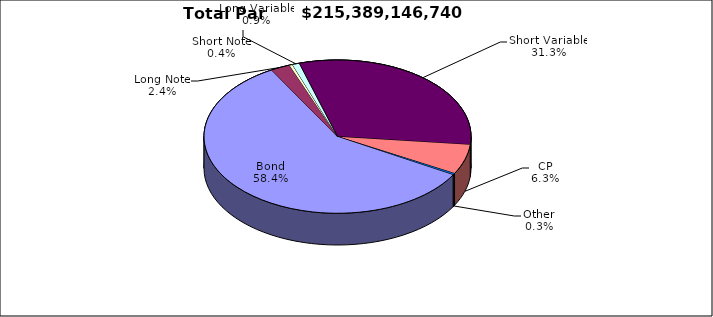
| Category | Par Value |
|---|---|
| Bond | 125878886568 |
| Long Note | 5088515695 |
| Short Note | 812709412 |
| Long Variable | 1845357174 |
| Short Variable | 67484419800 |
| CP | 13537680000 |
| Other | 741578091 |